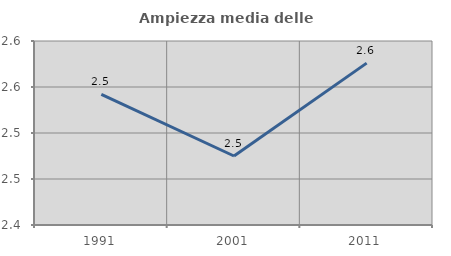
| Category | Ampiezza media delle famiglie |
|---|---|
| 1991.0 | 2.542 |
| 2001.0 | 2.475 |
| 2011.0 | 2.576 |